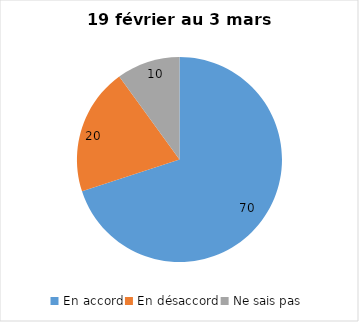
| Category | Series 0 |
|---|---|
| En accord | 70 |
| En désaccord | 20 |
| Ne sais pas | 10 |